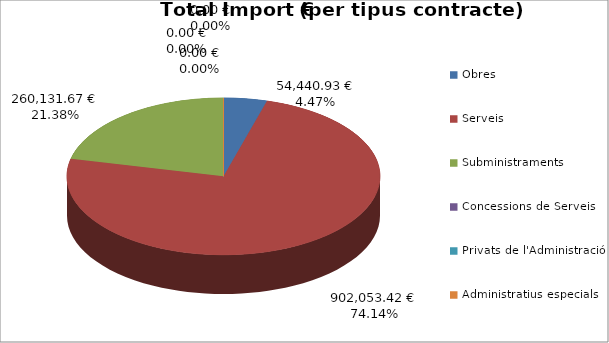
| Category | Total preu              (amb iva) |
|---|---|
| Obres | 54440.93 |
| Serveis | 902053.42 |
| Subministraments | 260131.67 |
| Concessions de Serveis | 0 |
| Privats de l'Administració | 0 |
| Administratius especials | 0 |